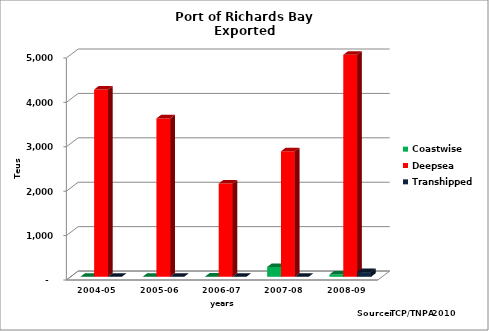
| Category | Coastwise | Deepsea | Transhipped |
|---|---|---|---|
| 2004-05 | 0 | 4218 | 0 |
| 2005-06 | 0 | 3567 | 0 |
| 2006-07 | 2 | 2101 | 0 |
| 2007-08 | 221 | 2827 | 0 |
| 2008-09 | 52 | 4999 | 105 |